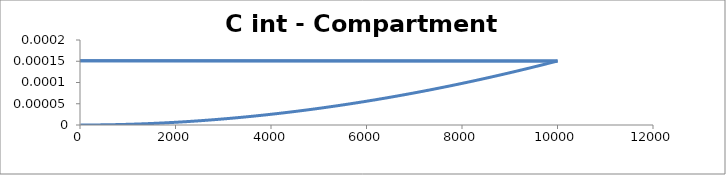
| Category | C - Sys 3 |
|---|---|
| 10.0 | 0 |
| 20.0 | 0 |
| 30.0 | 0 |
| 40.0 | 0 |
| 50.0 | 0 |
| 60.0 | 0 |
| 70.0 | 0 |
| 80.0 | 0 |
| 90.00000000000001 | 0 |
| 100.0 | 0 |
| 110.0 | 0 |
| 120.0 | 0 |
| 130.0 | 0 |
| 140.0 | 0 |
| 150.0 | 0 |
| 160.0 | 0 |
| 170.0 | 0 |
| 180.00000000000003 | 0 |
| 190.0 | 0 |
| 200.0 | 0 |
| 210.0 | 0 |
| 220.0 | 0 |
| 230.0 | 0 |
| 240.0 | 0 |
| 250.0 | 0 |
| 260.0 | 0 |
| 270.0 | 0 |
| 280.0 | 0 |
| 290.0 | 0 |
| 300.0 | 0 |
| 310.0 | 0 |
| 320.0 | 0 |
| 330.0 | 0 |
| 340.0 | 0 |
| 350.00000000000006 | 0 |
| 360.00000000000006 | 0 |
| 370.0 | 0 |
| 380.0 | 0 |
| 390.0 | 0 |
| 400.0 | 0 |
| 410.0 | 0 |
| 420.0 | 0 |
| 430.00000000000006 | 0 |
| 440.0 | 0 |
| 450.0 | 0 |
| 460.0 | 0 |
| 470.0 | 0 |
| 480.0 | 0 |
| 490.0 | 0 |
| 500.0 | 0 |
| 510.00000000000006 | 0 |
| 520.0 | 0 |
| 530.0 | 0 |
| 540.0 | 0 |
| 550.0 | 0 |
| 560.0 | 0 |
| 570.0 | 0 |
| 580.0 | 0 |
| 590.0 | 0 |
| 600.0 | 0 |
| 610.0 | 0 |
| 620.0 | 0 |
| 630.0 | 0 |
| 640.0 | 0 |
| 650.0 | 0 |
| 660.0 | 0 |
| 670.0 | 0 |
| 680.0 | 0 |
| 690.0000000000001 | 0 |
| 700.0000000000001 | 0 |
| 710.0000000000001 | 0 |
| 720.0000000000001 | 0 |
| 730.0 | 0 |
| 740.0 | 0 |
| 750.0 | 0 |
| 760.0 | 0 |
| 770.0 | 0 |
| 780.0 | 0 |
| 790.0 | 0 |
| 800.0 | 0 |
| 810.0 | 0 |
| 820.0 | 0 |
| 830.0 | 0 |
| 840.0 | 0 |
| 850.0000000000001 | 0 |
| 860.0000000000001 | 0 |
| 870.0000000000001 | 0 |
| 880.0 | 0 |
| 890.0 | 0 |
| 900.0 | 0 |
| 910.0 | 0 |
| 920.0 | 0 |
| 930.0 | 0 |
| 940.0 | 0 |
| 950.0 | 0 |
| 960.0 | 0 |
| 970.0 | 0 |
| 980.0 | 0 |
| 990.0 | 0 |
| 1000.0 | 0 |
| 1010.0000000000001 | 0 |
| 1020.0000000000001 | 0 |
| 1030.0 | 0 |
| 1040.0 | 0 |
| 1050.0 | 0 |
| 1060.0 | 0 |
| 1070.0 | 0 |
| 1080.0 | 0 |
| 1090.0 | 0 |
| 1100.0 | 0 |
| 1110.0 | 0 |
| 1120.0 | 0 |
| 1130.0 | 0 |
| 1140.0 | 0 |
| 1150.0 | 0 |
| 1160.0 | 0 |
| 1170.0 | 0 |
| 1180.0 | 0 |
| 1190.0 | 0 |
| 1200.0 | 0 |
| 1210.0 | 0 |
| 1220.0 | 0 |
| 1230.0 | 0 |
| 1240.0 | 0 |
| 1250.0 | 0 |
| 1260.0 | 0 |
| 1270.0 | 0 |
| 1280.0 | 0 |
| 1290.0 | 0 |
| 1300.0 | 0 |
| 1310.0 | 0 |
| 1320.0 | 0 |
| 1330.0 | 0 |
| 1340.0 | 0 |
| 1350.0 | 0 |
| 1360.0 | 0 |
| 1370.0 | 0 |
| 1380.0000000000002 | 0 |
| 1390.0000000000002 | 0 |
| 1400.0000000000002 | 0 |
| 1410.0000000000002 | 0 |
| 1420.0000000000002 | 0 |
| 1430.0000000000002 | 0 |
| 1440.0000000000002 | 0 |
| 1450.0 | 0 |
| 1460.0 | 0 |
| 1470.0 | 0 |
| 1480.0 | 0 |
| 1490.0 | 0 |
| 1500.0 | 0 |
| 1510.0 | 0 |
| 1520.0 | 0 |
| 1530.0 | 0 |
| 1540.0 | 0 |
| 1550.0 | 0 |
| 1560.0 | 0 |
| 1570.0 | 0 |
| 1580.0 | 0 |
| 1590.0 | 0 |
| 1600.0 | 0 |
| 1610.0 | 0 |
| 1620.0 | 0 |
| 1630.0 | 0 |
| 1640.0 | 0 |
| 1650.0 | 0 |
| 1660.0 | 0 |
| 1670.0 | 0 |
| 1680.0 | 0 |
| 1690.0 | 0 |
| 1700.0000000000002 | 0 |
| 1710.0000000000002 | 0 |
| 1720.0000000000002 | 0 |
| 1730.0000000000002 | 0 |
| 1740.0000000000002 | 0 |
| 1750.0000000000002 | 0 |
| 1760.0 | 0 |
| 1770.0 | 0 |
| 1780.0 | 0 |
| 1790.0 | 0 |
| 1800.0 | 0 |
| 1810.0 | 0 |
| 1820.0 | 0 |
| 1830.0 | 0 |
| 1840.0 | 0 |
| 1850.0 | 0 |
| 1860.0 | 0 |
| 1870.0 | 0 |
| 1880.0 | 0 |
| 1890.0 | 0 |
| 1900.0 | 0 |
| 1910.0 | 0 |
| 1920.0 | 0 |
| 1930.0 | 0 |
| 1940.0 | 0 |
| 1950.0 | 0 |
| 1960.0 | 0 |
| 1970.0 | 0 |
| 1980.0 | 0 |
| 1990.0 | 0 |
| 2000.0 | 0 |
| 2010.0000000000002 | 0 |
| 2020.0000000000002 | 0 |
| 2030.0000000000002 | 0 |
| 2040.0000000000002 | 0 |
| 2050.0 | 0 |
| 2060.0 | 0 |
| 2070.0 | 0 |
| 2080.0 | 0 |
| 2090.0 | 0 |
| 2100.0 | 0 |
| 2110.0 | 0 |
| 2120.0 | 0 |
| 2130.0 | 0 |
| 2140.0 | 0 |
| 2150.0 | 0 |
| 2160.0 | 0 |
| 2170.0 | 0 |
| 2180.0 | 0 |
| 2190.0 | 0 |
| 2200.0 | 0 |
| 2210.0 | 0 |
| 2220.0 | 0 |
| 2230.0 | 0 |
| 2240.0 | 0 |
| 2250.0 | 0 |
| 2260.0 | 0 |
| 2270.0 | 0 |
| 2280.0 | 0 |
| 2290.0 | 0 |
| 2300.0 | 0 |
| 2310.0 | 0 |
| 2320.0 | 0 |
| 2330.0 | 0 |
| 2340.0 | 0 |
| 2350.0 | 0 |
| 2360.0 | 0 |
| 2370.0 | 0 |
| 2380.0 | 0 |
| 2390.0 | 0 |
| 2400.0 | 0 |
| 2410.0 | 0 |
| 2420.0 | 0 |
| 2430.0 | 0 |
| 2440.0 | 0 |
| 2450.0 | 0 |
| 2460.0 | 0 |
| 2470.0 | 0 |
| 2480.0 | 0 |
| 2490.0 | 0 |
| 2500.0 | 0 |
| 2510.0 | 0 |
| 2520.0 | 0 |
| 2530.0 | 0 |
| 2540.0 | 0 |
| 2550.0 | 0 |
| 2560.0 | 0 |
| 2570.0 | 0 |
| 2580.0 | 0 |
| 2590.0 | 0 |
| 2600.0 | 0 |
| 2610.0 | 0 |
| 2620.0 | 0 |
| 2630.0 | 0 |
| 2640.0 | 0 |
| 2650.0 | 0 |
| 2660.0 | 0 |
| 2670.0 | 0 |
| 2680.0 | 0 |
| 2690.0 | 0 |
| 2700.0 | 0 |
| 2710.0 | 0 |
| 2720.0 | 0 |
| 2730.0 | 0 |
| 2740.0 | 0 |
| 2750.0 | 0 |
| 2760.0000000000005 | 0 |
| 2770.0000000000005 | 0 |
| 2780.0000000000005 | 0 |
| 2790.0000000000005 | 0 |
| 2800.0000000000005 | 0 |
| 2810.0000000000005 | 0 |
| 2820.0000000000005 | 0 |
| 2830.0000000000005 | 0 |
| 2840.0000000000005 | 0 |
| 2850.0000000000005 | 0 |
| 2860.0000000000005 | 0 |
| 2870.0000000000005 | 0 |
| 2880.0000000000005 | 0 |
| 2890.0 | 0 |
| 2900.0 | 0 |
| 2910.0 | 0 |
| 2920.0 | 0 |
| 2930.0 | 0 |
| 2940.0 | 0 |
| 2950.0 | 0 |
| 2960.0 | 0 |
| 2970.0 | 0 |
| 2980.0 | 0 |
| 2990.0 | 0 |
| 3000.0 | 0 |
| 3010.0 | 0 |
| 3020.0 | 0 |
| 3030.0 | 0 |
| 3040.0 | 0 |
| 3050.0 | 0 |
| 3060.0 | 0 |
| 3070.0 | 0 |
| 3080.0 | 0 |
| 3090.0 | 0 |
| 3100.0 | 0 |
| 3110.0 | 0 |
| 3120.0 | 0 |
| 3130.0 | 0 |
| 3140.0 | 0 |
| 3150.0 | 0 |
| 3160.0 | 0 |
| 3170.0 | 0 |
| 3180.0 | 0 |
| 3190.0 | 0 |
| 3200.0 | 0 |
| 3210.0 | 0 |
| 3220.0 | 0 |
| 3230.0 | 0 |
| 3240.0 | 0 |
| 3250.0 | 0 |
| 3260.0 | 0 |
| 3270.0 | 0 |
| 3280.0 | 0 |
| 3290.0 | 0 |
| 3300.0 | 0 |
| 3310.0 | 0 |
| 3320.0 | 0 |
| 3330.0 | 0 |
| 3340.0 | 0 |
| 3350.0 | 0 |
| 3360.0 | 0 |
| 3370.0 | 0 |
| 3380.0 | 0 |
| 3390.0000000000005 | 0 |
| 3400.0000000000005 | 0 |
| 3410.0000000000005 | 0 |
| 3420.0000000000005 | 0 |
| 3430.0000000000005 | 0 |
| 3440.0000000000005 | 0 |
| 3450.0000000000005 | 0 |
| 3460.0000000000005 | 0 |
| 3470.0000000000005 | 0 |
| 3480.0000000000005 | 0 |
| 3490.0000000000005 | 0 |
| 3500.0000000000005 | 0 |
| 3510.0000000000005 | 0 |
| 3520.0 | 0 |
| 3530.0 | 0 |
| 3540.0 | 0 |
| 3550.0 | 0 |
| 3560.0 | 0 |
| 3570.0 | 0 |
| 3580.0 | 0 |
| 3590.0 | 0 |
| 3600.0 | 0 |
| 3610.0 | 0 |
| 3620.0 | 0 |
| 3630.0 | 0 |
| 3640.0 | 0 |
| 3650.0 | 0 |
| 3660.0 | 0 |
| 3670.0 | 0 |
| 3680.0 | 0 |
| 3690.0 | 0 |
| 3700.0 | 0 |
| 3710.0 | 0 |
| 3720.0 | 0 |
| 3730.0 | 0 |
| 3740.0 | 0 |
| 3750.0 | 0 |
| 3760.0 | 0 |
| 3770.0 | 0 |
| 3780.0 | 0 |
| 3790.0 | 0 |
| 3800.0 | 0 |
| 3810.0 | 0 |
| 3820.0 | 0 |
| 3830.0 | 0 |
| 3840.0 | 0 |
| 3850.0 | 0 |
| 3860.0 | 0 |
| 3870.0 | 0 |
| 3880.0 | 0 |
| 3890.0 | 0 |
| 3900.0 | 0 |
| 3910.0 | 0 |
| 3920.0 | 0 |
| 3930.0 | 0 |
| 3940.0 | 0 |
| 3950.0 | 0 |
| 3960.0 | 0 |
| 3970.0 | 0 |
| 3980.0 | 0 |
| 3990.0 | 0 |
| 4000.0 | 0 |
| 4010.0000000000005 | 0 |
| 4020.0000000000005 | 0 |
| 4030.0000000000005 | 0 |
| 4040.0000000000005 | 0 |
| 4050.0000000000005 | 0 |
| 4060.0000000000005 | 0 |
| 4070.0000000000005 | 0 |
| 4080.0000000000005 | 0 |
| 4090.0000000000005 | 0 |
| 4100.0 | 0 |
| 4110.0 | 0 |
| 4120.0 | 0 |
| 4130.0 | 0 |
| 4140.0 | 0 |
| 4150.0 | 0 |
| 4160.0 | 0 |
| 4170.0 | 0 |
| 4180.0 | 0 |
| 4190.0 | 0 |
| 4200.0 | 0 |
| 4210.0 | 0 |
| 4220.0 | 0 |
| 4230.0 | 0 |
| 4240.0 | 0 |
| 4250.0 | 0 |
| 4260.0 | 0 |
| 4270.0 | 0 |
| 4280.0 | 0 |
| 4290.0 | 0 |
| 4300.0 | 0 |
| 4310.0 | 0 |
| 4320.0 | 0 |
| 4330.0 | 0 |
| 4340.0 | 0 |
| 4350.0 | 0 |
| 4360.0 | 0 |
| 4370.0 | 0 |
| 4380.0 | 0 |
| 4390.0 | 0 |
| 4400.0 | 0 |
| 4410.0 | 0 |
| 4420.0 | 0 |
| 4430.0 | 0 |
| 4440.0 | 0 |
| 4450.0 | 0 |
| 4460.0 | 0 |
| 4470.0 | 0 |
| 4480.0 | 0 |
| 4490.0 | 0 |
| 4500.0 | 0 |
| 4510.0 | 0 |
| 4520.0 | 0 |
| 4530.0 | 0 |
| 4540.0 | 0 |
| 4550.0 | 0 |
| 4560.0 | 0 |
| 4570.0 | 0 |
| 4580.0 | 0 |
| 4590.0 | 0 |
| 4600.0 | 0 |
| 4610.0 | 0 |
| 4620.0 | 0 |
| 4630.0 | 0 |
| 4640.0 | 0 |
| 4650.0 | 0 |
| 4660.0 | 0 |
| 4670.0 | 0 |
| 4680.0 | 0 |
| 4690.0 | 0 |
| 4700.0 | 0 |
| 4710.0 | 0 |
| 4720.0 | 0 |
| 4730.0 | 0 |
| 4740.0 | 0 |
| 4750.0 | 0 |
| 4760.0 | 0 |
| 4770.0 | 0 |
| 4780.0 | 0 |
| 4790.0 | 0 |
| 4800.0 | 0 |
| 4810.0 | 0 |
| 4820.0 | 0 |
| 4830.0 | 0 |
| 4840.0 | 0 |
| 4850.0 | 0 |
| 4860.0 | 0 |
| 4870.0 | 0 |
| 4880.0 | 0 |
| 4890.0 | 0 |
| 4900.0 | 0 |
| 4910.0 | 0 |
| 4920.0 | 0 |
| 4930.0 | 0 |
| 4940.0 | 0 |
| 4950.0 | 0 |
| 4960.0 | 0 |
| 4970.0 | 0 |
| 4980.0 | 0 |
| 4990.0 | 0 |
| 5000.0 | 0 |
| 5010.0 | 0 |
| 5020.0 | 0 |
| 5030.0 | 0 |
| 5040.0 | 0 |
| 5050.0 | 0 |
| 5060.0 | 0 |
| 5070.0 | 0 |
| 5080.0 | 0 |
| 5090.0 | 0 |
| 5100.0 | 0 |
| 5110.0 | 0 |
| 5120.0 | 0 |
| 5130.0 | 0 |
| 5140.0 | 0 |
| 5150.0 | 0 |
| 5160.0 | 0 |
| 5170.0 | 0 |
| 5180.0 | 0 |
| 5190.0 | 0 |
| 5200.0 | 0 |
| 5210.0 | 0 |
| 5220.0 | 0 |
| 5230.0 | 0 |
| 5240.0 | 0 |
| 5250.0 | 0 |
| 5260.0 | 0 |
| 5270.0 | 0 |
| 5280.0 | 0 |
| 5290.0 | 0 |
| 5300.0 | 0 |
| 5310.0 | 0 |
| 5320.0 | 0 |
| 5330.0 | 0 |
| 5340.0 | 0 |
| 5350.0 | 0 |
| 5360.0 | 0 |
| 5370.0 | 0 |
| 5380.0 | 0 |
| 5390.0 | 0 |
| 5400.0 | 0 |
| 5410.0 | 0 |
| 5420.0 | 0 |
| 5430.0 | 0 |
| 5440.0 | 0 |
| 5450.0 | 0 |
| 5460.0 | 0 |
| 5470.0 | 0 |
| 5480.0 | 0 |
| 5490.0 | 0 |
| 5500.0 | 0 |
| 5510.0 | 0 |
| 5520.000000000001 | 0 |
| 5530.000000000001 | 0 |
| 5540.000000000001 | 0 |
| 5550.000000000001 | 0 |
| 5560.000000000001 | 0 |
| 5570.000000000001 | 0 |
| 5580.000000000001 | 0 |
| 5590.000000000001 | 0 |
| 5600.000000000001 | 0 |
| 5610.000000000001 | 0 |
| 5620.000000000001 | 0 |
| 5630.000000000001 | 0 |
| 5640.000000000001 | 0 |
| 5650.000000000001 | 0 |
| 5660.000000000001 | 0 |
| 5670.000000000001 | 0 |
| 5680.000000000001 | 0 |
| 5690.000000000001 | 0 |
| 5700.000000000001 | 0 |
| 5710.000000000001 | 0 |
| 5720.000000000001 | 0 |
| 5730.000000000001 | 0 |
| 5740.000000000001 | 0 |
| 5750.000000000001 | 0 |
| 5760.000000000001 | 0 |
| 5770.0 | 0 |
| 5780.0 | 0 |
| 5790.0 | 0 |
| 5800.0 | 0 |
| 5810.0 | 0 |
| 5820.0 | 0 |
| 5830.0 | 0 |
| 5840.0 | 0 |
| 5850.0 | 0 |
| 5860.0 | 0 |
| 5870.0 | 0 |
| 5880.0 | 0 |
| 5890.0 | 0 |
| 5900.0 | 0 |
| 5910.0 | 0 |
| 5920.0 | 0 |
| 5930.0 | 0 |
| 5940.0 | 0 |
| 5950.0 | 0 |
| 5960.0 | 0 |
| 5970.0 | 0 |
| 5980.0 | 0 |
| 5990.0 | 0 |
| 6000.0 | 0 |
| 6010.0 | 0 |
| 6020.0 | 0 |
| 6030.0 | 0 |
| 6040.0 | 0 |
| 6050.0 | 0 |
| 6060.0 | 0 |
| 6070.0 | 0 |
| 6080.0 | 0 |
| 6090.0 | 0 |
| 6100.0 | 0 |
| 6110.0 | 0 |
| 6120.0 | 0 |
| 6130.0 | 0 |
| 6140.0 | 0 |
| 6150.0 | 0 |
| 6160.0 | 0 |
| 6170.0 | 0 |
| 6180.0 | 0 |
| 6190.0 | 0 |
| 6200.0 | 0 |
| 6210.0 | 0 |
| 6220.0 | 0 |
| 6230.0 | 0 |
| 6240.0 | 0 |
| 6250.0 | 0 |
| 6260.0 | 0 |
| 6270.0 | 0 |
| 6280.0 | 0 |
| 6290.0 | 0 |
| 6300.0 | 0 |
| 6310.0 | 0 |
| 6320.0 | 0 |
| 6330.0 | 0 |
| 6340.0 | 0 |
| 6350.0 | 0 |
| 6360.0 | 0 |
| 6370.0 | 0 |
| 6380.0 | 0 |
| 6390.0 | 0 |
| 6400.0 | 0 |
| 6410.0 | 0 |
| 6420.0 | 0 |
| 6430.0 | 0 |
| 6440.0 | 0 |
| 6450.0 | 0 |
| 6460.0 | 0 |
| 6470.0 | 0 |
| 6480.0 | 0 |
| 6490.0 | 0 |
| 6500.0 | 0 |
| 6510.0 | 0 |
| 6520.0 | 0 |
| 6530.0 | 0 |
| 6540.0 | 0 |
| 6550.0 | 0 |
| 6560.0 | 0 |
| 6570.0 | 0 |
| 6580.0 | 0 |
| 6590.0 | 0 |
| 6600.0 | 0 |
| 6610.0 | 0 |
| 6620.0 | 0 |
| 6630.0 | 0 |
| 6640.0 | 0 |
| 6650.0 | 0 |
| 6660.0 | 0 |
| 6670.0 | 0 |
| 6680.0 | 0 |
| 6690.0 | 0 |
| 6700.0 | 0 |
| 6710.0 | 0 |
| 6720.0 | 0 |
| 6730.0 | 0 |
| 6740.0 | 0 |
| 6750.0 | 0 |
| 6760.0 | 0 |
| 6770.000000000001 | 0 |
| 6780.000000000001 | 0 |
| 6790.000000000001 | 0 |
| 6800.000000000001 | 0 |
| 6810.000000000001 | 0 |
| 6820.000000000001 | 0 |
| 6830.000000000001 | 0 |
| 6840.000000000001 | 0 |
| 6850.000000000001 | 0 |
| 6860.000000000001 | 0 |
| 6870.000000000001 | 0 |
| 6880.000000000001 | 0 |
| 6890.000000000001 | 0 |
| 6900.000000000001 | 0 |
| 6910.000000000001 | 0 |
| 6920.000000000001 | 0 |
| 6930.000000000001 | 0 |
| 6940.000000000001 | 0 |
| 6950.000000000001 | 0 |
| 6960.000000000001 | 0 |
| 6970.000000000001 | 0 |
| 6980.000000000001 | 0 |
| 6990.000000000001 | 0 |
| 7000.000000000001 | 0 |
| 7010.000000000001 | 0 |
| 7020.000000000001 | 0 |
| 7030.000000000001 | 0 |
| 7040.0 | 0 |
| 7050.0 | 0 |
| 7060.0 | 0 |
| 7070.0 | 0 |
| 7080.0 | 0 |
| 7090.0 | 0 |
| 7100.0 | 0 |
| 7110.0 | 0 |
| 7120.0 | 0 |
| 7130.0 | 0 |
| 7140.0 | 0 |
| 7150.0 | 0 |
| 7160.0 | 0 |
| 7170.0 | 0 |
| 7180.0 | 0 |
| 7190.0 | 0 |
| 7200.0 | 0 |
| 7210.0 | 0 |
| 7220.0 | 0 |
| 7230.0 | 0 |
| 7240.0 | 0 |
| 7250.0 | 0 |
| 7260.0 | 0 |
| 7270.0 | 0 |
| 7280.0 | 0 |
| 7290.0 | 0 |
| 7300.0 | 0 |
| 7310.0 | 0 |
| 7320.0 | 0 |
| 7330.0 | 0 |
| 7340.0 | 0 |
| 7350.0 | 0 |
| 7360.0 | 0 |
| 7370.0 | 0 |
| 7380.0 | 0 |
| 7390.0 | 0 |
| 7400.0 | 0 |
| 7410.0 | 0 |
| 7420.0 | 0 |
| 7430.0 | 0 |
| 7440.0 | 0 |
| 7450.0 | 0 |
| 7460.0 | 0 |
| 7470.0 | 0 |
| 7480.0 | 0 |
| 7490.0 | 0 |
| 7500.0 | 0 |
| 7510.0 | 0 |
| 7520.0 | 0 |
| 7530.0 | 0 |
| 7540.0 | 0 |
| 7550.0 | 0 |
| 7560.0 | 0 |
| 7570.0 | 0 |
| 7580.0 | 0 |
| 7590.0 | 0 |
| 7600.0 | 0 |
| 7610.0 | 0 |
| 7620.0 | 0 |
| 7630.0 | 0 |
| 7640.0 | 0 |
| 7650.0 | 0 |
| 7660.0 | 0 |
| 7670.0 | 0 |
| 7680.0 | 0 |
| 7690.0 | 0 |
| 7700.0 | 0 |
| 7710.0 | 0 |
| 7720.0 | 0 |
| 7730.0 | 0 |
| 7740.0 | 0 |
| 7750.0 | 0 |
| 7760.0 | 0 |
| 7770.0 | 0 |
| 7780.0 | 0 |
| 7790.0 | 0 |
| 7800.0 | 0 |
| 7810.0 | 0 |
| 7820.0 | 0 |
| 7830.0 | 0 |
| 7840.0 | 0 |
| 7850.0 | 0 |
| 7860.0 | 0 |
| 7870.0 | 0 |
| 7880.0 | 0 |
| 7890.0 | 0 |
| 7900.0 | 0 |
| 7910.0 | 0 |
| 7920.0 | 0 |
| 7930.0 | 0 |
| 7940.0 | 0 |
| 7950.0 | 0 |
| 7960.0 | 0 |
| 7970.0 | 0 |
| 7980.0 | 0 |
| 7990.0 | 0 |
| 8000.0 | 0 |
| 8010.0 | 0 |
| 8020.000000000001 | 0 |
| 8030.000000000001 | 0 |
| 8040.000000000001 | 0 |
| 8050.000000000001 | 0 |
| 8060.000000000001 | 0 |
| 8070.000000000001 | 0 |
| 8080.000000000001 | 0 |
| 8090.000000000001 | 0 |
| 8100.000000000001 | 0 |
| 8110.000000000001 | 0 |
| 8120.000000000001 | 0 |
| 8130.000000000001 | 0 |
| 8140.000000000001 | 0 |
| 8150.000000000001 | 0 |
| 8160.000000000001 | 0 |
| 8170.000000000001 | 0 |
| 8180.000000000001 | 0 |
| 8190.000000000001 | 0 |
| 8200.0 | 0 |
| 8210.0 | 0 |
| 8220.0 | 0 |
| 8230.0 | 0 |
| 8240.0 | 0 |
| 8250.0 | 0 |
| 8260.0 | 0 |
| 8270.0 | 0 |
| 8280.0 | 0 |
| 8290.0 | 0 |
| 8300.0 | 0 |
| 8310.0 | 0 |
| 8320.0 | 0 |
| 8330.0 | 0 |
| 8340.0 | 0 |
| 8350.0 | 0 |
| 8360.0 | 0 |
| 8370.0 | 0 |
| 8380.0 | 0 |
| 8390.0 | 0 |
| 8400.0 | 0 |
| 8410.0 | 0 |
| 8420.0 | 0 |
| 8430.0 | 0 |
| 8440.0 | 0 |
| 8450.0 | 0 |
| 8460.0 | 0 |
| 8470.0 | 0 |
| 8480.0 | 0 |
| 8490.0 | 0 |
| 8500.0 | 0 |
| 8510.0 | 0 |
| 8520.0 | 0 |
| 8530.0 | 0 |
| 8540.0 | 0 |
| 8550.0 | 0 |
| 8560.0 | 0 |
| 8570.0 | 0 |
| 8580.0 | 0 |
| 8590.0 | 0 |
| 8600.0 | 0 |
| 8610.0 | 0 |
| 8620.0 | 0 |
| 8630.0 | 0 |
| 8640.0 | 0 |
| 8650.0 | 0 |
| 8660.0 | 0 |
| 8670.0 | 0 |
| 8680.0 | 0 |
| 8690.0 | 0 |
| 8700.0 | 0 |
| 8710.0 | 0 |
| 8720.0 | 0 |
| 8730.0 | 0 |
| 8740.0 | 0 |
| 8750.0 | 0 |
| 8760.0 | 0 |
| 8770.0 | 0 |
| 8780.0 | 0 |
| 8790.0 | 0 |
| 8800.0 | 0 |
| 8810.0 | 0 |
| 8820.0 | 0 |
| 8830.0 | 0 |
| 8840.0 | 0 |
| 8850.0 | 0 |
| 8860.0 | 0 |
| 8870.0 | 0 |
| 8880.0 | 0 |
| 8890.0 | 0 |
| 8900.0 | 0 |
| 8910.0 | 0 |
| 8920.0 | 0 |
| 8930.0 | 0 |
| 8940.0 | 0 |
| 8950.0 | 0 |
| 8960.0 | 0 |
| 8970.0 | 0 |
| 8980.0 | 0 |
| 8990.0 | 0 |
| 9000.0 | 0 |
| 9010.0 | 0 |
| 9020.0 | 0 |
| 9030.0 | 0 |
| 9040.0 | 0 |
| 9050.0 | 0 |
| 9060.0 | 0 |
| 9070.0 | 0 |
| 9080.0 | 0 |
| 9090.0 | 0 |
| 9100.0 | 0 |
| 9110.0 | 0 |
| 9120.0 | 0 |
| 9130.0 | 0 |
| 9140.0 | 0 |
| 9150.0 | 0 |
| 9160.0 | 0 |
| 9170.0 | 0 |
| 9180.0 | 0 |
| 9190.0 | 0 |
| 9200.0 | 0 |
| 9210.0 | 0 |
| 9220.0 | 0 |
| 9230.0 | 0 |
| 9240.0 | 0 |
| 9250.0 | 0 |
| 9260.0 | 0 |
| 9270.0 | 0 |
| 9280.0 | 0 |
| 9290.0 | 0 |
| 9300.0 | 0 |
| 9310.0 | 0 |
| 9320.0 | 0 |
| 9330.0 | 0 |
| 9340.0 | 0 |
| 9350.0 | 0 |
| 9360.0 | 0 |
| 9370.0 | 0 |
| 9380.0 | 0 |
| 9390.0 | 0 |
| 9400.0 | 0 |
| 9410.0 | 0 |
| 9420.0 | 0 |
| 9430.0 | 0 |
| 9440.0 | 0 |
| 9450.0 | 0 |
| 9460.0 | 0 |
| 9470.0 | 0 |
| 9480.0 | 0 |
| 9490.0 | 0 |
| 9500.0 | 0 |
| 9510.0 | 0 |
| 9520.0 | 0 |
| 9530.0 | 0 |
| 9540.0 | 0 |
| 9550.0 | 0 |
| 9560.0 | 0 |
| 9570.0 | 0 |
| 9580.0 | 0 |
| 9590.0 | 0 |
| 9600.0 | 0 |
| 9610.0 | 0 |
| 9620.0 | 0 |
| 9630.0 | 0 |
| 9640.0 | 0 |
| 9650.0 | 0 |
| 9660.0 | 0 |
| 9670.0 | 0 |
| 9680.0 | 0 |
| 9690.0 | 0 |
| 9700.0 | 0 |
| 9710.0 | 0 |
| 9720.0 | 0 |
| 9730.0 | 0 |
| 9740.0 | 0 |
| 9750.0 | 0 |
| 9760.0 | 0 |
| 9770.0 | 0 |
| 9780.0 | 0 |
| 9790.0 | 0 |
| 9800.0 | 0 |
| 9810.0 | 0 |
| 9820.0 | 0 |
| 9830.0 | 0 |
| 9840.0 | 0 |
| 9850.0 | 0 |
| 9860.0 | 0 |
| 9870.0 | 0 |
| 9880.0 | 0 |
| 9890.0 | 0 |
| 9900.0 | 0 |
| 9910.0 | 0 |
| 9920.0 | 0 |
| 9930.0 | 0 |
| 9940.0 | 0 |
| 9950.0 | 0 |
| 9960.0 | 0 |
| 9970.0 | 0 |
| 9980.0 | 0 |
| 9990.0 | 0 |
| 10000.0 | 0 |